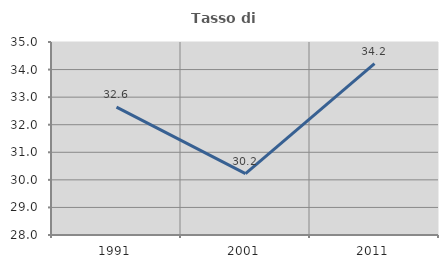
| Category | Tasso di occupazione   |
|---|---|
| 1991.0 | 32.64 |
| 2001.0 | 30.225 |
| 2011.0 | 34.217 |